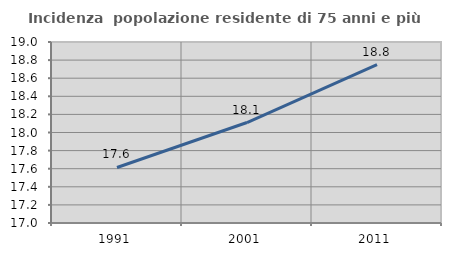
| Category | Incidenza  popolazione residente di 75 anni e più |
|---|---|
| 1991.0 | 17.614 |
| 2001.0 | 18.11 |
| 2011.0 | 18.75 |